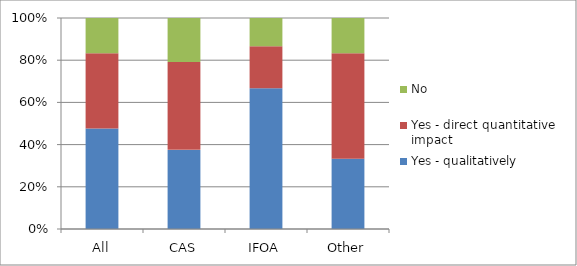
| Category | Yes - qualitatively | Yes - direct quantitative impact | No |
|---|---|---|---|
| All | 0.476 | 0.357 | 0.167 |
| CAS | 0.375 | 0.417 | 0.208 |
| IFOA | 0.667 | 0.2 | 0.133 |
| Other | 0.333 | 0.5 | 0.167 |